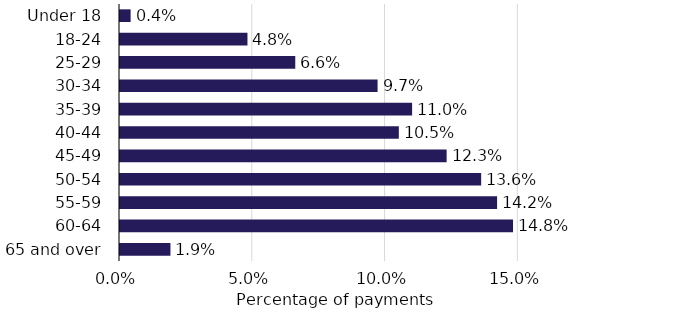
| Category | Series 0 |
|---|---|
| Under 18 | 0.004 |
| 18-24 | 0.048 |
| 25-29 | 0.066 |
| 30-34 | 0.097 |
| 35-39 | 0.11 |
| 40-44 | 0.105 |
| 45-49 | 0.123 |
| 50-54 | 0.136 |
| 55-59 | 0.142 |
| 60-64 | 0.148 |
| 65 and over | 0.019 |